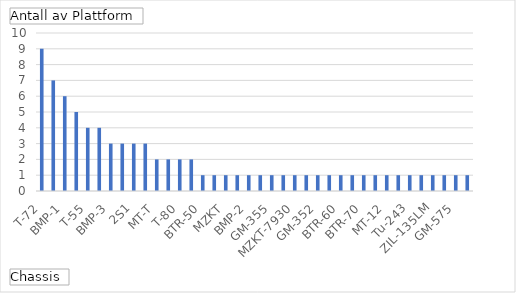
| Category | Totalt |
|---|---|
| T-72 | 9 |
| MT-LB | 7 |
| BMP-1 | 6 |
| Towed | 5 |
| T-55 | 4 |
| BTR-80 | 4 |
| BMP-3 | 3 |
| GM-569 | 3 |
| 2S1 | 3 |
| T-90 | 3 |
| MT-T | 2 |
| T-64 | 2 |
| T-80 | 2 |
| SA-4 | 2 |
| BTR-50 | 1 |
| BAZ-5937 | 1 |
| MZKT | 1 |
| GAZ-2330 | 1 |
| BMP-2 | 1 |
| BRDM-2 | 1 |
| GM-355 | 1 |
| Pchela-1 | 1 |
| MZKT-7930 | 1 |
| T-54 | 1 |
| GM-352 | 1 |
| Ural 375-D | 1 |
| BTR-60 | 1 |
| ZIL-157 | 1 |
| BTR-70 | 1 |
| MAZ-543M | 1 |
| MT-12 | 1 |
| GMZ | 1 |
| Tu-243 | 1 |
| IVECO | 1 |
| ZIL-135LM | 1 |
| Kamaz-4326 | 1 |
|  GM-575 | 1 |
| Kamaz-6396 | 1 |